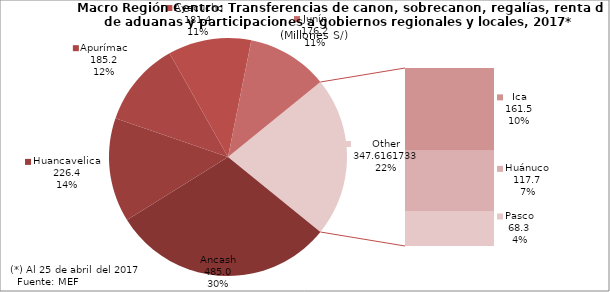
| Category | 2016 |
|---|---|
| Ancash | 484.987 |
| Huancavelica | 226.447 |
| Apurímac | 185.201 |
| Ayacucho | 181.403 |
| Junín | 176.207 |
| Ica | 161.535 |
| Huánuco | 117.749 |
| Pasco | 68.332 |